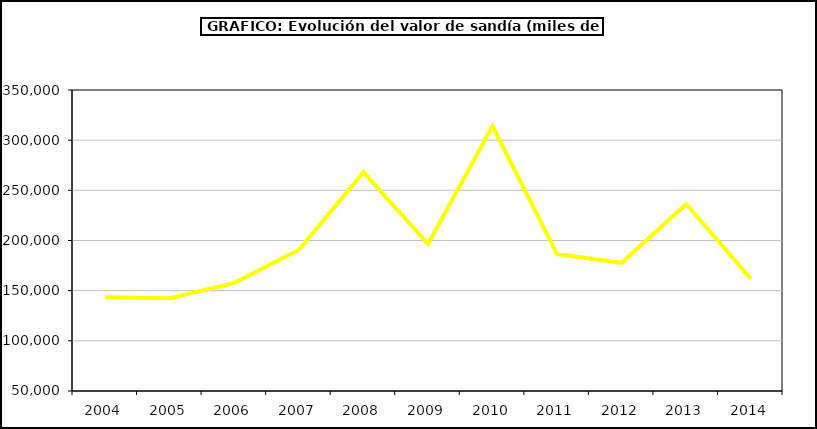
| Category | Valor |
|---|---|
| 2004.0 | 143489.366 |
| 2005.0 | 142484.958 |
| 2006.0 | 157801.742 |
| 2007.0 | 190776.416 |
| 2008.0 | 268149.211 |
| 2009.0 | 196465.666 |
| 2010.0 | 314067.402 |
| 2011.0 | 186441.033 |
| 2012.0 | 177750.096 |
| 2013.0 | 236329.828 |
| 2014.0 | 161950.328 |